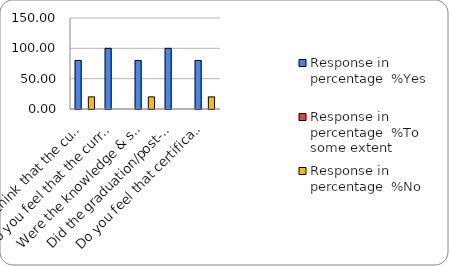
| Category | Response in percentage  |
|---|---|
| Do you think that the curriculum which you had during your graduation/post graduation has provided you with the knowledge & skills necessary to get employed/Self-employed or start own business? | 20 |
| Do you feel that the curriculum you studied is helpful in progression to higher studies? | 0 |
| Were the knowledge & skills acquired through the curriculum useful to you while working on the job?   | 20 |
| Did the graduation/post-graduation programme bring about any attitudinal and behavioural change in you? | 0 |
| Do you feel that certificate/ diploma courses offered by the college in addition to the curriculum lead to better career prospects? | 20 |